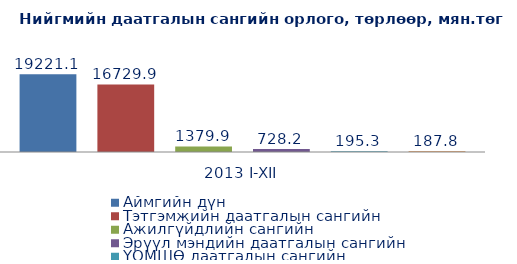
| Category | Аймгийн дүн | Тэтгэмжийн даатгалын сангийн | Ажилгүйдлийн сангийн  | Эрүүл мэндийн даатгалын сангийн | ҮОМШӨ даатгалын сангийн  | Тэтгэврийн даатгалын сангийн  |
|---|---|---|---|---|---|---|
| 2013 I-XII | 19221.1 | 16729.9 | 1379.9 | 728.2 | 195.3 | 187.8 |